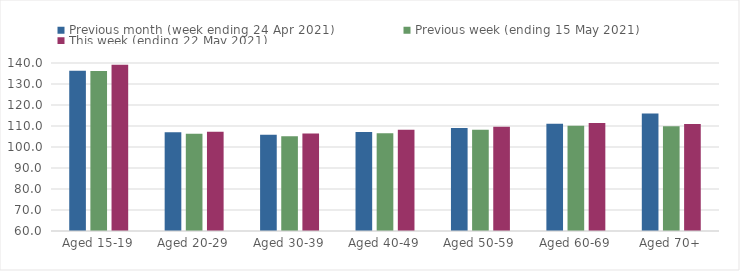
| Category | Previous month (week ending 24 Apr 2021) | Previous week (ending 15 May 2021) | This week (ending 22 May 2021) |
|---|---|---|---|
| Aged 15-19 | 136.31 | 136.17 | 139.11 |
| Aged 20-29 | 107 | 106.29 | 107.22 |
| Aged 30-39 | 105.82 | 105.15 | 106.44 |
| Aged 40-49 | 107.19 | 106.54 | 108.18 |
| Aged 50-59 | 109.05 | 108.16 | 109.69 |
| Aged 60-69 | 111.02 | 110.12 | 111.39 |
| Aged 70+ | 115.9 | 109.88 | 110.95 |